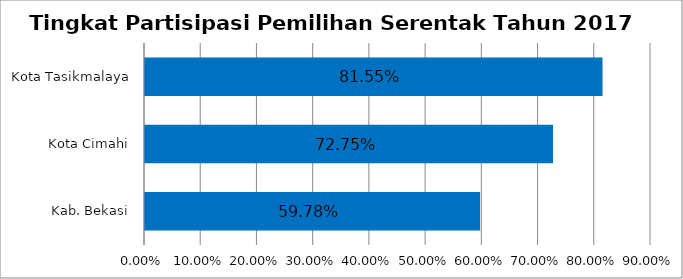
| Category | Series 0 |
|---|---|
| Kab. Bekasi | 0.598 |
| Kota Cimahi | 0.727 |
| Kota Tasikmalaya | 0.816 |